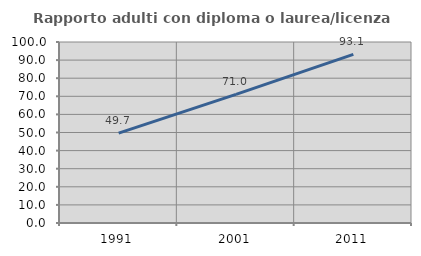
| Category | Rapporto adulti con diploma o laurea/licenza media  |
|---|---|
| 1991.0 | 49.665 |
| 2001.0 | 71.043 |
| 2011.0 | 93.146 |